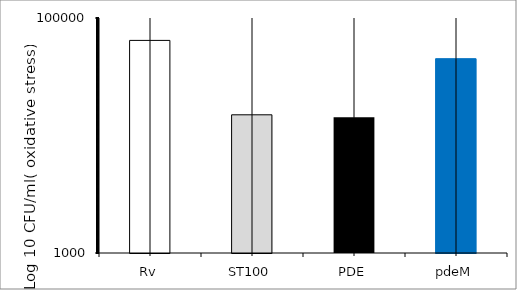
| Category | Series 0 |
|---|---|
| Rv | 64466.667 |
| ST100 | 15000 |
| PDE | 14266.667 |
| pdeM | 45066.667 |